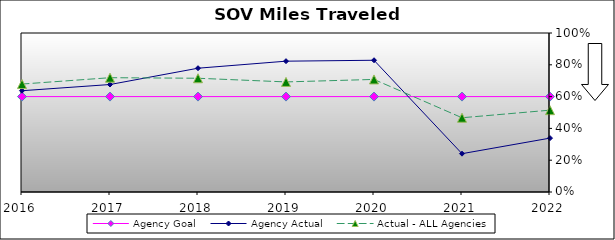
| Category | Agency Goal | Agency Actual | Actual - ALL Agencies |
|---|---|---|---|
| 2016.0 | 0.6 | 0.637 | 0.679 |
| 2017.0 | 0.6 | 0.676 | 0.719 |
| 2018.0 | 0.6 | 0.778 | 0.715 |
| 2019.0 | 0.6 | 0.823 | 0.692 |
| 2020.0 | 0.6 | 0.829 | 0.708 |
| 2021.0 | 0.6 | 0.241 | 0.467 |
| 2022.0 | 0.6 | 0.339 | 0.515 |